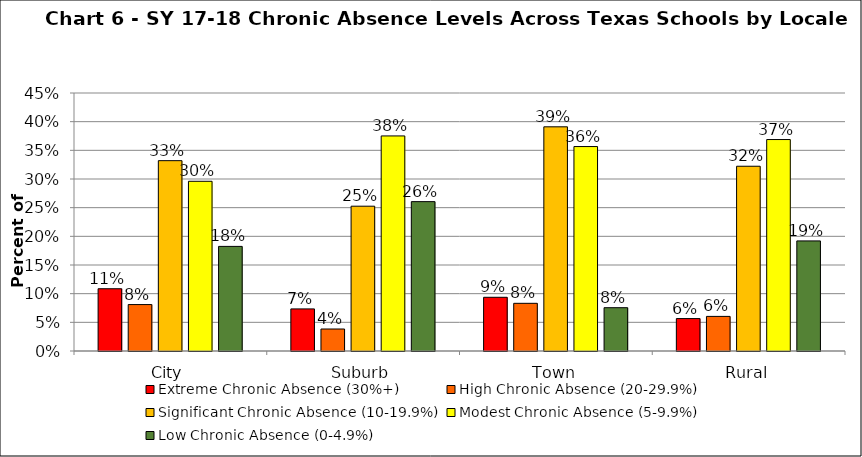
| Category | Extreme Chronic Absence (30%+) | High Chronic Absence (20-29.9%) | Significant Chronic Absence (10-19.9%) | Modest Chronic Absence (5-9.9%) | Low Chronic Absence (0-4.9%) |
|---|---|---|---|---|---|
| 0 | 0.109 | 0.081 | 0.332 | 0.296 | 0.182 |
| 1 | 0.073 | 0.038 | 0.253 | 0.375 | 0.261 |
| 2 | 0.094 | 0.083 | 0.391 | 0.357 | 0.076 |
| 3 | 0.057 | 0.06 | 0.322 | 0.369 | 0.192 |